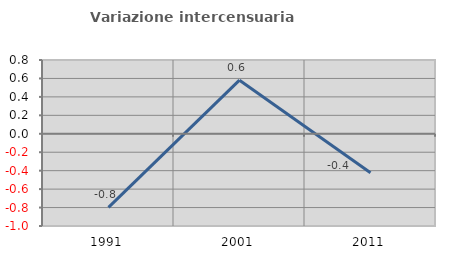
| Category | Variazione intercensuaria annua |
|---|---|
| 1991.0 | -0.797 |
| 2001.0 | 0.581 |
| 2011.0 | -0.422 |